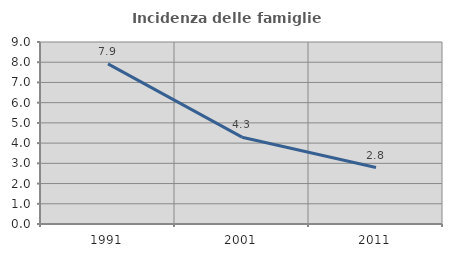
| Category | Incidenza delle famiglie numerose |
|---|---|
| 1991.0 | 7.918 |
| 2001.0 | 4.294 |
| 2011.0 | 2.791 |